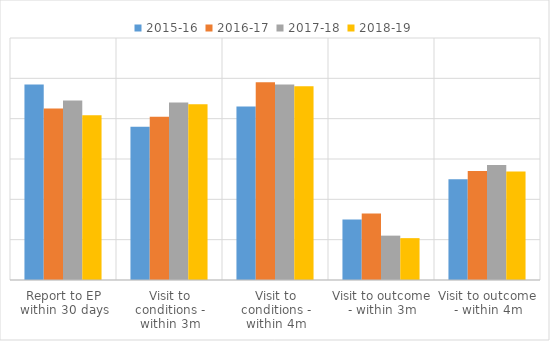
| Category | 2015-16 | 2016-17 | 2017-18 | 2018-19 |
|---|---|---|---|---|
| Report to EP within 30 days | 0.97 | 0.85 | 0.89 | 0.817 |
| Visit to conditions - within 3m | 0.76 | 0.81 | 0.88 | 0.871 |
| Visit to conditions - within 4m | 0.86 | 0.98 | 0.97 | 0.96 |
| Visit to outcome - within 3m | 0.3 | 0.33 | 0.22 | 0.208 |
| Visit to outcome - within 4m | 0.5 | 0.54 | 0.57 | 0.538 |